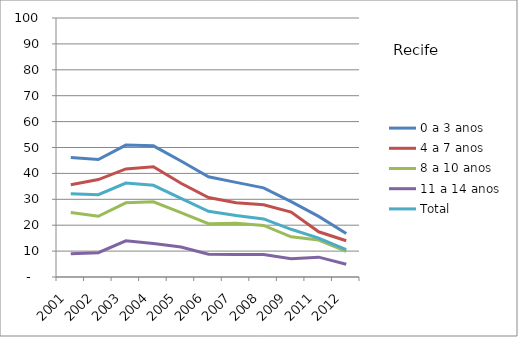
| Category | 0 a 3 anos | 4 a 7 anos | 8 a 10 anos | 11 a 14 anos | Total |
|---|---|---|---|---|---|
| 2001.0 | 46.16 | 35.62 | 24.91 | 8.95 | 32.15 |
| 2002.0 | 45.37 | 37.62 | 23.43 | 9.38 | 31.78 |
| 2003.0 | 50.94 | 41.73 | 28.63 | 13.98 | 36.27 |
| 2004.0 | 50.64 | 42.56 | 29.04 | 12.94 | 35.41 |
| 2005.0 | 44.78 | 36.19 | 24.85 | 11.57 | 30.38 |
| 2006.0 | 38.69 | 30.68 | 20.6 | 8.82 | 25.37 |
| 2007.0 | 36.54 | 28.64 | 20.78 | 8.73 | 23.76 |
| 2008.0 | 34.41 | 27.9 | 19.91 | 8.64 | 22.42 |
| 2009.0 | 29.12 | 25.09 | 15.5 | 7.04 | 18.42 |
| 2011.0 | 23.4 | 17.46 | 14.28 | 7.66 | 15.02 |
| 2012.0 | 16.83 | 14 | 9.88 | 4.94 | 10.58 |